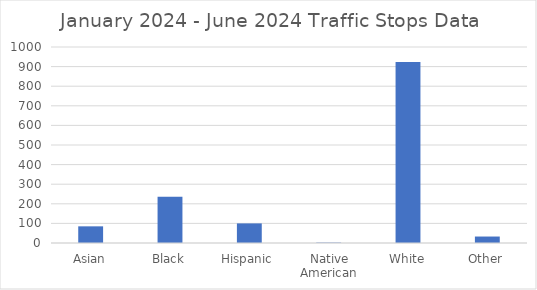
| Category | Series 0 |
|---|---|
| Asian | 85 |
| Black | 236 |
| Hispanic | 100 |
| Native American | 2 |
| White | 924 |
| Other | 33 |